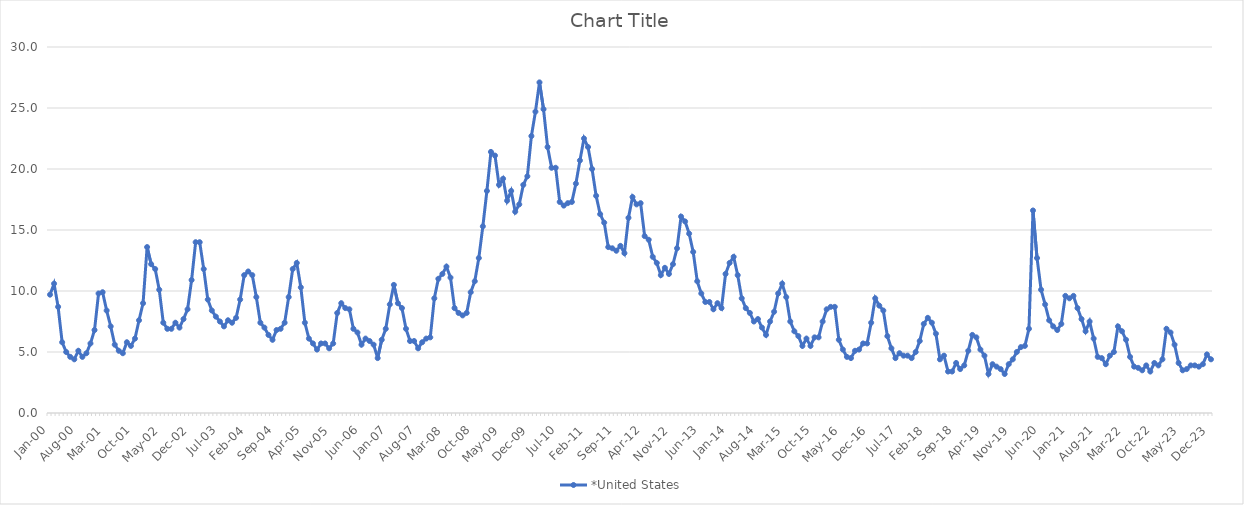
| Category | *United States | Alaska | Alabama | Arkansas | Arizona | California | Colorado | Connecticut | Delaware | Florida | Georgia | Hawaii | Iowa | Idaho | Illinois | Indiana | Kansas | Kentucky | Louisiana | Massachusetts | Maryland | Maine | Michigan | Minnesota | Missouri | Mississippi | Montana | North Carolina | North Dakota | Nebraska | New Hampshire | New Jersey | New Mexico | Nevada | New York | Ohio | Oklahoma | Oregon | Pennsylvania | Rhode Island | South Carolina | South Dakota | Tennessee | Texas | Utah | Virginia | Vermont | Washington | Wisconsin | West Virginia | Wyoming |
|---|---|---|---|---|---|---|---|---|---|---|---|---|---|---|---|---|---|---|---|---|---|---|---|---|---|---|---|---|---|---|---|---|---|---|---|---|---|---|---|---|---|---|---|---|---|---|---|---|---|---|---|
| Jan-00 | 9.7 |  |  |  |  |  |  |  |  |  |  |  |  |  |  |  |  |  |  |  |  |  |  |  |  |  |  |  |  |  |  |  |  |  |  |  |  |  |  |  |  |  |  |  |  |  |  |  |  |  |  |
| Feb-00 | 10.6 |  |  |  |  |  |  |  |  |  |  |  |  |  |  |  |  |  |  |  |  |  |  |  |  |  |  |  |  |  |  |  |  |  |  |  |  |  |  |  |  |  |  |  |  |  |  |  |  |  |  |
| Mar-00 | 8.7 |  |  |  |  |  |  |  |  |  |  |  |  |  |  |  |  |  |  |  |  |  |  |  |  |  |  |  |  |  |  |  |  |  |  |  |  |  |  |  |  |  |  |  |  |  |  |  |  |  |  |
| Apr-00 | 5.8 |  |  |  |  |  |  |  |  |  |  |  |  |  |  |  |  |  |  |  |  |  |  |  |  |  |  |  |  |  |  |  |  |  |  |  |  |  |  |  |  |  |  |  |  |  |  |  |  |  |  |
| May-00 | 5 |  |  |  |  |  |  |  |  |  |  |  |  |  |  |  |  |  |  |  |  |  |  |  |  |  |  |  |  |  |  |  |  |  |  |  |  |  |  |  |  |  |  |  |  |  |  |  |  |  |  |
| Jun-00 | 4.6 |  |  |  |  |  |  |  |  |  |  |  |  |  |  |  |  |  |  |  |  |  |  |  |  |  |  |  |  |  |  |  |  |  |  |  |  |  |  |  |  |  |  |  |  |  |  |  |  |  |  |
| Jul-00 | 4.4 |  |  |  |  |  |  |  |  |  |  |  |  |  |  |  |  |  |  |  |  |  |  |  |  |  |  |  |  |  |  |  |  |  |  |  |  |  |  |  |  |  |  |  |  |  |  |  |  |  |  |
| Aug-00 | 5.1 |  |  |  |  |  |  |  |  |  |  |  |  |  |  |  |  |  |  |  |  |  |  |  |  |  |  |  |  |  |  |  |  |  |  |  |  |  |  |  |  |  |  |  |  |  |  |  |  |  |  |
| Sep-00 | 4.6 |  |  |  |  |  |  |  |  |  |  |  |  |  |  |  |  |  |  |  |  |  |  |  |  |  |  |  |  |  |  |  |  |  |  |  |  |  |  |  |  |  |  |  |  |  |  |  |  |  |  |
| Oct-00 | 4.9 |  |  |  |  |  |  |  |  |  |  |  |  |  |  |  |  |  |  |  |  |  |  |  |  |  |  |  |  |  |  |  |  |  |  |  |  |  |  |  |  |  |  |  |  |  |  |  |  |  |  |
| Nov-00 | 5.7 |  |  |  |  |  |  |  |  |  |  |  |  |  |  |  |  |  |  |  |  |  |  |  |  |  |  |  |  |  |  |  |  |  |  |  |  |  |  |  |  |  |  |  |  |  |  |  |  |  |  |
| Dec-00 | 6.8 |  |  |  |  |  |  |  |  |  |  |  |  |  |  |  |  |  |  |  |  |  |  |  |  |  |  |  |  |  |  |  |  |  |  |  |  |  |  |  |  |  |  |  |  |  |  |  |  |  |  |
| Jan-01 | 9.8 |  |  |  |  |  |  |  |  |  |  |  |  |  |  |  |  |  |  |  |  |  |  |  |  |  |  |  |  |  |  |  |  |  |  |  |  |  |  |  |  |  |  |  |  |  |  |  |  |  |  |
| Feb-01 | 9.9 |  |  |  |  |  |  |  |  |  |  |  |  |  |  |  |  |  |  |  |  |  |  |  |  |  |  |  |  |  |  |  |  |  |  |  |  |  |  |  |  |  |  |  |  |  |  |  |  |  |  |
| Mar-01 | 8.4 |  |  |  |  |  |  |  |  |  |  |  |  |  |  |  |  |  |  |  |  |  |  |  |  |  |  |  |  |  |  |  |  |  |  |  |  |  |  |  |  |  |  |  |  |  |  |  |  |  |  |
| Apr-01 | 7.1 |  |  |  |  |  |  |  |  |  |  |  |  |  |  |  |  |  |  |  |  |  |  |  |  |  |  |  |  |  |  |  |  |  |  |  |  |  |  |  |  |  |  |  |  |  |  |  |  |  |  |
| May-01 | 5.6 |  |  |  |  |  |  |  |  |  |  |  |  |  |  |  |  |  |  |  |  |  |  |  |  |  |  |  |  |  |  |  |  |  |  |  |  |  |  |  |  |  |  |  |  |  |  |  |  |  |  |
| Jun-01 | 5.1 |  |  |  |  |  |  |  |  |  |  |  |  |  |  |  |  |  |  |  |  |  |  |  |  |  |  |  |  |  |  |  |  |  |  |  |  |  |  |  |  |  |  |  |  |  |  |  |  |  |  |
| Jul-01 | 4.9 |  |  |  |  |  |  |  |  |  |  |  |  |  |  |  |  |  |  |  |  |  |  |  |  |  |  |  |  |  |  |  |  |  |  |  |  |  |  |  |  |  |  |  |  |  |  |  |  |  |  |
| Aug-01 | 5.8 |  |  |  |  |  |  |  |  |  |  |  |  |  |  |  |  |  |  |  |  |  |  |  |  |  |  |  |  |  |  |  |  |  |  |  |  |  |  |  |  |  |  |  |  |  |  |  |  |  |  |
| Sep-01 | 5.5 |  |  |  |  |  |  |  |  |  |  |  |  |  |  |  |  |  |  |  |  |  |  |  |  |  |  |  |  |  |  |  |  |  |  |  |  |  |  |  |  |  |  |  |  |  |  |  |  |  |  |
| Oct-01 | 6.1 |  |  |  |  |  |  |  |  |  |  |  |  |  |  |  |  |  |  |  |  |  |  |  |  |  |  |  |  |  |  |  |  |  |  |  |  |  |  |  |  |  |  |  |  |  |  |  |  |  |  |
| Nov-01 | 7.6 |  |  |  |  |  |  |  |  |  |  |  |  |  |  |  |  |  |  |  |  |  |  |  |  |  |  |  |  |  |  |  |  |  |  |  |  |  |  |  |  |  |  |  |  |  |  |  |  |  |  |
| Dec-01 | 9 |  |  |  |  |  |  |  |  |  |  |  |  |  |  |  |  |  |  |  |  |  |  |  |  |  |  |  |  |  |  |  |  |  |  |  |  |  |  |  |  |  |  |  |  |  |  |  |  |  |  |
| Jan-02 | 13.6 |  |  |  |  |  |  |  |  |  |  |  |  |  |  |  |  |  |  |  |  |  |  |  |  |  |  |  |  |  |  |  |  |  |  |  |  |  |  |  |  |  |  |  |  |  |  |  |  |  |  |
| Feb-02 | 12.2 |  |  |  |  |  |  |  |  |  |  |  |  |  |  |  |  |  |  |  |  |  |  |  |  |  |  |  |  |  |  |  |  |  |  |  |  |  |  |  |  |  |  |  |  |  |  |  |  |  |  |
| Mar-02 | 11.8 |  |  |  |  |  |  |  |  |  |  |  |  |  |  |  |  |  |  |  |  |  |  |  |  |  |  |  |  |  |  |  |  |  |  |  |  |  |  |  |  |  |  |  |  |  |  |  |  |  |  |
| Apr-02 | 10.1 |  |  |  |  |  |  |  |  |  |  |  |  |  |  |  |  |  |  |  |  |  |  |  |  |  |  |  |  |  |  |  |  |  |  |  |  |  |  |  |  |  |  |  |  |  |  |  |  |  |  |
| May-02 | 7.4 |  |  |  |  |  |  |  |  |  |  |  |  |  |  |  |  |  |  |  |  |  |  |  |  |  |  |  |  |  |  |  |  |  |  |  |  |  |  |  |  |  |  |  |  |  |  |  |  |  |  |
| Jun-02 | 6.9 |  |  |  |  |  |  |  |  |  |  |  |  |  |  |  |  |  |  |  |  |  |  |  |  |  |  |  |  |  |  |  |  |  |  |  |  |  |  |  |  |  |  |  |  |  |  |  |  |  |  |
| Jul-02 | 6.9 |  |  |  |  |  |  |  |  |  |  |  |  |  |  |  |  |  |  |  |  |  |  |  |  |  |  |  |  |  |  |  |  |  |  |  |  |  |  |  |  |  |  |  |  |  |  |  |  |  |  |
| Aug-02 | 7.4 |  |  |  |  |  |  |  |  |  |  |  |  |  |  |  |  |  |  |  |  |  |  |  |  |  |  |  |  |  |  |  |  |  |  |  |  |  |  |  |  |  |  |  |  |  |  |  |  |  |  |
| Sep-02 | 7 |  |  |  |  |  |  |  |  |  |  |  |  |  |  |  |  |  |  |  |  |  |  |  |  |  |  |  |  |  |  |  |  |  |  |  |  |  |  |  |  |  |  |  |  |  |  |  |  |  |  |
| Oct-02 | 7.7 |  |  |  |  |  |  |  |  |  |  |  |  |  |  |  |  |  |  |  |  |  |  |  |  |  |  |  |  |  |  |  |  |  |  |  |  |  |  |  |  |  |  |  |  |  |  |  |  |  |  |
| Nov-02 | 8.5 |  |  |  |  |  |  |  |  |  |  |  |  |  |  |  |  |  |  |  |  |  |  |  |  |  |  |  |  |  |  |  |  |  |  |  |  |  |  |  |  |  |  |  |  |  |  |  |  |  |  |
| Dec-02 | 10.9 |  |  |  |  |  |  |  |  |  |  |  |  |  |  |  |  |  |  |  |  |  |  |  |  |  |  |  |  |  |  |  |  |  |  |  |  |  |  |  |  |  |  |  |  |  |  |  |  |  |  |
| Jan-03 | 14 |  |  |  |  |  |  |  |  |  |  |  |  |  |  |  |  |  |  |  |  |  |  |  |  |  |  |  |  |  |  |  |  |  |  |  |  |  |  |  |  |  |  |  |  |  |  |  |  |  |  |
| Feb-03 | 14 |  |  |  |  |  |  |  |  |  |  |  |  |  |  |  |  |  |  |  |  |  |  |  |  |  |  |  |  |  |  |  |  |  |  |  |  |  |  |  |  |  |  |  |  |  |  |  |  |  |  |
| Mar-03 | 11.8 |  |  |  |  |  |  |  |  |  |  |  |  |  |  |  |  |  |  |  |  |  |  |  |  |  |  |  |  |  |  |  |  |  |  |  |  |  |  |  |  |  |  |  |  |  |  |  |  |  |  |
| Apr-03 | 9.3 |  |  |  |  |  |  |  |  |  |  |  |  |  |  |  |  |  |  |  |  |  |  |  |  |  |  |  |  |  |  |  |  |  |  |  |  |  |  |  |  |  |  |  |  |  |  |  |  |  |  |
| May-03 | 8.4 |  |  |  |  |  |  |  |  |  |  |  |  |  |  |  |  |  |  |  |  |  |  |  |  |  |  |  |  |  |  |  |  |  |  |  |  |  |  |  |  |  |  |  |  |  |  |  |  |  |  |
| Jun-03 | 7.9 |  |  |  |  |  |  |  |  |  |  |  |  |  |  |  |  |  |  |  |  |  |  |  |  |  |  |  |  |  |  |  |  |  |  |  |  |  |  |  |  |  |  |  |  |  |  |  |  |  |  |
| Jul-03 | 7.5 |  |  |  |  |  |  |  |  |  |  |  |  |  |  |  |  |  |  |  |  |  |  |  |  |  |  |  |  |  |  |  |  |  |  |  |  |  |  |  |  |  |  |  |  |  |  |  |  |  |  |
| Aug-03 | 7.1 |  |  |  |  |  |  |  |  |  |  |  |  |  |  |  |  |  |  |  |  |  |  |  |  |  |  |  |  |  |  |  |  |  |  |  |  |  |  |  |  |  |  |  |  |  |  |  |  |  |  |
| Sep-03 | 7.6 |  |  |  |  |  |  |  |  |  |  |  |  |  |  |  |  |  |  |  |  |  |  |  |  |  |  |  |  |  |  |  |  |  |  |  |  |  |  |  |  |  |  |  |  |  |  |  |  |  |  |
| Oct-03 | 7.4 |  |  |  |  |  |  |  |  |  |  |  |  |  |  |  |  |  |  |  |  |  |  |  |  |  |  |  |  |  |  |  |  |  |  |  |  |  |  |  |  |  |  |  |  |  |  |  |  |  |  |
| Nov-03 | 7.8 |  |  |  |  |  |  |  |  |  |  |  |  |  |  |  |  |  |  |  |  |  |  |  |  |  |  |  |  |  |  |  |  |  |  |  |  |  |  |  |  |  |  |  |  |  |  |  |  |  |  |
| Dec-03 | 9.3 |  |  |  |  |  |  |  |  |  |  |  |  |  |  |  |  |  |  |  |  |  |  |  |  |  |  |  |  |  |  |  |  |  |  |  |  |  |  |  |  |  |  |  |  |  |  |  |  |  |  |
| Jan-04 | 11.3 |  |  |  |  |  |  |  |  |  |  |  |  |  |  |  |  |  |  |  |  |  |  |  |  |  |  |  |  |  |  |  |  |  |  |  |  |  |  |  |  |  |  |  |  |  |  |  |  |  |  |
| Feb-04 | 11.6 |  |  |  |  |  |  |  |  |  |  |  |  |  |  |  |  |  |  |  |  |  |  |  |  |  |  |  |  |  |  |  |  |  |  |  |  |  |  |  |  |  |  |  |  |  |  |  |  |  |  |
| Mar-04 | 11.3 |  |  |  |  |  |  |  |  |  |  |  |  |  |  |  |  |  |  |  |  |  |  |  |  |  |  |  |  |  |  |  |  |  |  |  |  |  |  |  |  |  |  |  |  |  |  |  |  |  |  |
| Apr-04 | 9.5 |  |  |  |  |  |  |  |  |  |  |  |  |  |  |  |  |  |  |  |  |  |  |  |  |  |  |  |  |  |  |  |  |  |  |  |  |  |  |  |  |  |  |  |  |  |  |  |  |  |  |
| May-04 | 7.4 |  |  |  |  |  |  |  |  |  |  |  |  |  |  |  |  |  |  |  |  |  |  |  |  |  |  |  |  |  |  |  |  |  |  |  |  |  |  |  |  |  |  |  |  |  |  |  |  |  |  |
| Jun-04 | 7 |  |  |  |  |  |  |  |  |  |  |  |  |  |  |  |  |  |  |  |  |  |  |  |  |  |  |  |  |  |  |  |  |  |  |  |  |  |  |  |  |  |  |  |  |  |  |  |  |  |  |
| Jul-04 | 6.4 |  |  |  |  |  |  |  |  |  |  |  |  |  |  |  |  |  |  |  |  |  |  |  |  |  |  |  |  |  |  |  |  |  |  |  |  |  |  |  |  |  |  |  |  |  |  |  |  |  |  |
| Aug-04 | 6 |  |  |  |  |  |  |  |  |  |  |  |  |  |  |  |  |  |  |  |  |  |  |  |  |  |  |  |  |  |  |  |  |  |  |  |  |  |  |  |  |  |  |  |  |  |  |  |  |  |  |
| Sep-04 | 6.8 |  |  |  |  |  |  |  |  |  |  |  |  |  |  |  |  |  |  |  |  |  |  |  |  |  |  |  |  |  |  |  |  |  |  |  |  |  |  |  |  |  |  |  |  |  |  |  |  |  |  |
| Oct-04 | 6.9 |  |  |  |  |  |  |  |  |  |  |  |  |  |  |  |  |  |  |  |  |  |  |  |  |  |  |  |  |  |  |  |  |  |  |  |  |  |  |  |  |  |  |  |  |  |  |  |  |  |  |
| Nov-04 | 7.4 |  |  |  |  |  |  |  |  |  |  |  |  |  |  |  |  |  |  |  |  |  |  |  |  |  |  |  |  |  |  |  |  |  |  |  |  |  |  |  |  |  |  |  |  |  |  |  |  |  |  |
| Dec-04 | 9.5 |  |  |  |  |  |  |  |  |  |  |  |  |  |  |  |  |  |  |  |  |  |  |  |  |  |  |  |  |  |  |  |  |  |  |  |  |  |  |  |  |  |  |  |  |  |  |  |  |  |  |
| Jan-05 | 11.8 |  |  |  |  |  |  |  |  |  |  |  |  |  |  |  |  |  |  |  |  |  |  |  |  |  |  |  |  |  |  |  |  |  |  |  |  |  |  |  |  |  |  |  |  |  |  |  |  |  |  |
| Feb-05 | 12.3 |  |  |  |  |  |  |  |  |  |  |  |  |  |  |  |  |  |  |  |  |  |  |  |  |  |  |  |  |  |  |  |  |  |  |  |  |  |  |  |  |  |  |  |  |  |  |  |  |  |  |
| Mar-05 | 10.3 |  |  |  |  |  |  |  |  |  |  |  |  |  |  |  |  |  |  |  |  |  |  |  |  |  |  |  |  |  |  |  |  |  |  |  |  |  |  |  |  |  |  |  |  |  |  |  |  |  |  |
| Apr-05 | 7.4 |  |  |  |  |  |  |  |  |  |  |  |  |  |  |  |  |  |  |  |  |  |  |  |  |  |  |  |  |  |  |  |  |  |  |  |  |  |  |  |  |  |  |  |  |  |  |  |  |  |  |
| May-05 | 6.1 |  |  |  |  |  |  |  |  |  |  |  |  |  |  |  |  |  |  |  |  |  |  |  |  |  |  |  |  |  |  |  |  |  |  |  |  |  |  |  |  |  |  |  |  |  |  |  |  |  |  |
| Jun-05 | 5.7 |  |  |  |  |  |  |  |  |  |  |  |  |  |  |  |  |  |  |  |  |  |  |  |  |  |  |  |  |  |  |  |  |  |  |  |  |  |  |  |  |  |  |  |  |  |  |  |  |  |  |
| Jul-05 | 5.2 |  |  |  |  |  |  |  |  |  |  |  |  |  |  |  |  |  |  |  |  |  |  |  |  |  |  |  |  |  |  |  |  |  |  |  |  |  |  |  |  |  |  |  |  |  |  |  |  |  |  |
| Aug-05 | 5.7 |  |  |  |  |  |  |  |  |  |  |  |  |  |  |  |  |  |  |  |  |  |  |  |  |  |  |  |  |  |  |  |  |  |  |  |  |  |  |  |  |  |  |  |  |  |  |  |  |  |  |
| Sep-05 | 5.7 |  |  |  |  |  |  |  |  |  |  |  |  |  |  |  |  |  |  |  |  |  |  |  |  |  |  |  |  |  |  |  |  |  |  |  |  |  |  |  |  |  |  |  |  |  |  |  |  |  |  |
| Oct-05 | 5.3 |  |  |  |  |  |  |  |  |  |  |  |  |  |  |  |  |  |  |  |  |  |  |  |  |  |  |  |  |  |  |  |  |  |  |  |  |  |  |  |  |  |  |  |  |  |  |  |  |  |  |
| Nov-05 | 5.7 |  |  |  |  |  |  |  |  |  |  |  |  |  |  |  |  |  |  |  |  |  |  |  |  |  |  |  |  |  |  |  |  |  |  |  |  |  |  |  |  |  |  |  |  |  |  |  |  |  |  |
| Dec-05 | 8.2 |  |  |  |  |  |  |  |  |  |  |  |  |  |  |  |  |  |  |  |  |  |  |  |  |  |  |  |  |  |  |  |  |  |  |  |  |  |  |  |  |  |  |  |  |  |  |  |  |  |  |
| Jan-06 | 9 |  |  |  |  |  |  |  |  |  |  |  |  |  |  |  |  |  |  |  |  |  |  |  |  |  |  |  |  |  |  |  |  |  |  |  |  |  |  |  |  |  |  |  |  |  |  |  |  |  |  |
| Feb-06 | 8.6 |  |  |  |  |  |  |  |  |  |  |  |  |  |  |  |  |  |  |  |  |  |  |  |  |  |  |  |  |  |  |  |  |  |  |  |  |  |  |  |  |  |  |  |  |  |  |  |  |  |  |
| Mar-06 | 8.5 |  |  |  |  |  |  |  |  |  |  |  |  |  |  |  |  |  |  |  |  |  |  |  |  |  |  |  |  |  |  |  |  |  |  |  |  |  |  |  |  |  |  |  |  |  |  |  |  |  |  |
| Apr-06 | 6.9 |  |  |  |  |  |  |  |  |  |  |  |  |  |  |  |  |  |  |  |  |  |  |  |  |  |  |  |  |  |  |  |  |  |  |  |  |  |  |  |  |  |  |  |  |  |  |  |  |  |  |
| May-06 | 6.6 |  |  |  |  |  |  |  |  |  |  |  |  |  |  |  |  |  |  |  |  |  |  |  |  |  |  |  |  |  |  |  |  |  |  |  |  |  |  |  |  |  |  |  |  |  |  |  |  |  |  |
| Jun-06 | 5.6 |  |  |  |  |  |  |  |  |  |  |  |  |  |  |  |  |  |  |  |  |  |  |  |  |  |  |  |  |  |  |  |  |  |  |  |  |  |  |  |  |  |  |  |  |  |  |  |  |  |  |
| Jul-06 | 6.1 |  |  |  |  |  |  |  |  |  |  |  |  |  |  |  |  |  |  |  |  |  |  |  |  |  |  |  |  |  |  |  |  |  |  |  |  |  |  |  |  |  |  |  |  |  |  |  |  |  |  |
| Aug-06 | 5.9 |  |  |  |  |  |  |  |  |  |  |  |  |  |  |  |  |  |  |  |  |  |  |  |  |  |  |  |  |  |  |  |  |  |  |  |  |  |  |  |  |  |  |  |  |  |  |  |  |  |  |
| Sep-06 | 5.6 |  |  |  |  |  |  |  |  |  |  |  |  |  |  |  |  |  |  |  |  |  |  |  |  |  |  |  |  |  |  |  |  |  |  |  |  |  |  |  |  |  |  |  |  |  |  |  |  |  |  |
| Oct-06 | 4.5 |  |  |  |  |  |  |  |  |  |  |  |  |  |  |  |  |  |  |  |  |  |  |  |  |  |  |  |  |  |  |  |  |  |  |  |  |  |  |  |  |  |  |  |  |  |  |  |  |  |  |
| Nov-06 | 6 |  |  |  |  |  |  |  |  |  |  |  |  |  |  |  |  |  |  |  |  |  |  |  |  |  |  |  |  |  |  |  |  |  |  |  |  |  |  |  |  |  |  |  |  |  |  |  |  |  |  |
| Dec-06 | 6.9 |  |  |  |  |  |  |  |  |  |  |  |  |  |  |  |  |  |  |  |  |  |  |  |  |  |  |  |  |  |  |  |  |  |  |  |  |  |  |  |  |  |  |  |  |  |  |  |  |  |  |
| Jan-07 | 8.9 |  |  |  |  |  |  |  |  |  |  |  |  |  |  |  |  |  |  |  |  |  |  |  |  |  |  |  |  |  |  |  |  |  |  |  |  |  |  |  |  |  |  |  |  |  |  |  |  |  |  |
| Feb-07 | 10.5 |  |  |  |  |  |  |  |  |  |  |  |  |  |  |  |  |  |  |  |  |  |  |  |  |  |  |  |  |  |  |  |  |  |  |  |  |  |  |  |  |  |  |  |  |  |  |  |  |  |  |
| Mar-07 | 9 |  |  |  |  |  |  |  |  |  |  |  |  |  |  |  |  |  |  |  |  |  |  |  |  |  |  |  |  |  |  |  |  |  |  |  |  |  |  |  |  |  |  |  |  |  |  |  |  |  |  |
| Apr-07 | 8.6 |  |  |  |  |  |  |  |  |  |  |  |  |  |  |  |  |  |  |  |  |  |  |  |  |  |  |  |  |  |  |  |  |  |  |  |  |  |  |  |  |  |  |  |  |  |  |  |  |  |  |
| May-07 | 6.9 |  |  |  |  |  |  |  |  |  |  |  |  |  |  |  |  |  |  |  |  |  |  |  |  |  |  |  |  |  |  |  |  |  |  |  |  |  |  |  |  |  |  |  |  |  |  |  |  |  |  |
| Jun-07 | 5.9 |  |  |  |  |  |  |  |  |  |  |  |  |  |  |  |  |  |  |  |  |  |  |  |  |  |  |  |  |  |  |  |  |  |  |  |  |  |  |  |  |  |  |  |  |  |  |  |  |  |  |
| Jul-07 | 5.9 |  |  |  |  |  |  |  |  |  |  |  |  |  |  |  |  |  |  |  |  |  |  |  |  |  |  |  |  |  |  |  |  |  |  |  |  |  |  |  |  |  |  |  |  |  |  |  |  |  |  |
| Aug-07 | 5.3 |  |  |  |  |  |  |  |  |  |  |  |  |  |  |  |  |  |  |  |  |  |  |  |  |  |  |  |  |  |  |  |  |  |  |  |  |  |  |  |  |  |  |  |  |  |  |  |  |  |  |
| Sep-07 | 5.8 |  |  |  |  |  |  |  |  |  |  |  |  |  |  |  |  |  |  |  |  |  |  |  |  |  |  |  |  |  |  |  |  |  |  |  |  |  |  |  |  |  |  |  |  |  |  |  |  |  |  |
| Oct-07 | 6.1 |  |  |  |  |  |  |  |  |  |  |  |  |  |  |  |  |  |  |  |  |  |  |  |  |  |  |  |  |  |  |  |  |  |  |  |  |  |  |  |  |  |  |  |  |  |  |  |  |  |  |
| Nov-07 | 6.2 |  |  |  |  |  |  |  |  |  |  |  |  |  |  |  |  |  |  |  |  |  |  |  |  |  |  |  |  |  |  |  |  |  |  |  |  |  |  |  |  |  |  |  |  |  |  |  |  |  |  |
| Dec-07 | 9.4 |  |  |  |  |  |  |  |  |  |  |  |  |  |  |  |  |  |  |  |  |  |  |  |  |  |  |  |  |  |  |  |  |  |  |  |  |  |  |  |  |  |  |  |  |  |  |  |  |  |  |
| Jan-08 | 11 |  |  |  |  |  |  |  |  |  |  |  |  |  |  |  |  |  |  |  |  |  |  |  |  |  |  |  |  |  |  |  |  |  |  |  |  |  |  |  |  |  |  |  |  |  |  |  |  |  |  |
| Feb-08 | 11.4 |  |  |  |  |  |  |  |  |  |  |  |  |  |  |  |  |  |  |  |  |  |  |  |  |  |  |  |  |  |  |  |  |  |  |  |  |  |  |  |  |  |  |  |  |  |  |  |  |  |  |
| Mar-08 | 12 |  |  |  |  |  |  |  |  |  |  |  |  |  |  |  |  |  |  |  |  |  |  |  |  |  |  |  |  |  |  |  |  |  |  |  |  |  |  |  |  |  |  |  |  |  |  |  |  |  |  |
| Apr-08 | 11.1 |  |  |  |  |  |  |  |  |  |  |  |  |  |  |  |  |  |  |  |  |  |  |  |  |  |  |  |  |  |  |  |  |  |  |  |  |  |  |  |  |  |  |  |  |  |  |  |  |  |  |
| May-08 | 8.6 |  |  |  |  |  |  |  |  |  |  |  |  |  |  |  |  |  |  |  |  |  |  |  |  |  |  |  |  |  |  |  |  |  |  |  |  |  |  |  |  |  |  |  |  |  |  |  |  |  |  |
| Jun-08 | 8.2 |  |  |  |  |  |  |  |  |  |  |  |  |  |  |  |  |  |  |  |  |  |  |  |  |  |  |  |  |  |  |  |  |  |  |  |  |  |  |  |  |  |  |  |  |  |  |  |  |  |  |
| Jul-08 | 8 |  |  |  |  |  |  |  |  |  |  |  |  |  |  |  |  |  |  |  |  |  |  |  |  |  |  |  |  |  |  |  |  |  |  |  |  |  |  |  |  |  |  |  |  |  |  |  |  |  |  |
| Aug-08 | 8.2 |  |  |  |  |  |  |  |  |  |  |  |  |  |  |  |  |  |  |  |  |  |  |  |  |  |  |  |  |  |  |  |  |  |  |  |  |  |  |  |  |  |  |  |  |  |  |  |  |  |  |
| Sep-08 | 9.9 |  |  |  |  |  |  |  |  |  |  |  |  |  |  |  |  |  |  |  |  |  |  |  |  |  |  |  |  |  |  |  |  |  |  |  |  |  |  |  |  |  |  |  |  |  |  |  |  |  |  |
| Oct-08 | 10.8 |  |  |  |  |  |  |  |  |  |  |  |  |  |  |  |  |  |  |  |  |  |  |  |  |  |  |  |  |  |  |  |  |  |  |  |  |  |  |  |  |  |  |  |  |  |  |  |  |  |  |
| Nov-08 | 12.7 |  |  |  |  |  |  |  |  |  |  |  |  |  |  |  |  |  |  |  |  |  |  |  |  |  |  |  |  |  |  |  |  |  |  |  |  |  |  |  |  |  |  |  |  |  |  |  |  |  |  |
| Dec-08 | 15.3 |  |  |  |  |  |  |  |  |  |  |  |  |  |  |  |  |  |  |  |  |  |  |  |  |  |  |  |  |  |  |  |  |  |  |  |  |  |  |  |  |  |  |  |  |  |  |  |  |  |  |
| Jan-09 | 18.2 |  |  |  |  |  |  |  |  |  |  |  |  |  |  |  |  |  |  |  |  |  |  |  |  |  |  |  |  |  |  |  |  |  |  |  |  |  |  |  |  |  |  |  |  |  |  |  |  |  |  |
| Feb-09 | 21.4 |  |  |  |  |  |  |  |  |  |  |  |  |  |  |  |  |  |  |  |  |  |  |  |  |  |  |  |  |  |  |  |  |  |  |  |  |  |  |  |  |  |  |  |  |  |  |  |  |  |  |
| Mar-09 | 21.1 |  |  |  |  |  |  |  |  |  |  |  |  |  |  |  |  |  |  |  |  |  |  |  |  |  |  |  |  |  |  |  |  |  |  |  |  |  |  |  |  |  |  |  |  |  |  |  |  |  |  |
| Apr-09 | 18.7 |  |  |  |  |  |  |  |  |  |  |  |  |  |  |  |  |  |  |  |  |  |  |  |  |  |  |  |  |  |  |  |  |  |  |  |  |  |  |  |  |  |  |  |  |  |  |  |  |  |  |
| May-09 | 19.2 |  |  |  |  |  |  |  |  |  |  |  |  |  |  |  |  |  |  |  |  |  |  |  |  |  |  |  |  |  |  |  |  |  |  |  |  |  |  |  |  |  |  |  |  |  |  |  |  |  |  |
| Jun-09 | 17.4 |  |  |  |  |  |  |  |  |  |  |  |  |  |  |  |  |  |  |  |  |  |  |  |  |  |  |  |  |  |  |  |  |  |  |  |  |  |  |  |  |  |  |  |  |  |  |  |  |  |  |
| Jul-09 | 18.2 |  |  |  |  |  |  |  |  |  |  |  |  |  |  |  |  |  |  |  |  |  |  |  |  |  |  |  |  |  |  |  |  |  |  |  |  |  |  |  |  |  |  |  |  |  |  |  |  |  |  |
| Aug-09 | 16.5 |  |  |  |  |  |  |  |  |  |  |  |  |  |  |  |  |  |  |  |  |  |  |  |  |  |  |  |  |  |  |  |  |  |  |  |  |  |  |  |  |  |  |  |  |  |  |  |  |  |  |
| Sep-09 | 17.1 |  |  |  |  |  |  |  |  |  |  |  |  |  |  |  |  |  |  |  |  |  |  |  |  |  |  |  |  |  |  |  |  |  |  |  |  |  |  |  |  |  |  |  |  |  |  |  |  |  |  |
| Oct-09 | 18.7 |  |  |  |  |  |  |  |  |  |  |  |  |  |  |  |  |  |  |  |  |  |  |  |  |  |  |  |  |  |  |  |  |  |  |  |  |  |  |  |  |  |  |  |  |  |  |  |  |  |  |
| Nov-09 | 19.4 |  |  |  |  |  |  |  |  |  |  |  |  |  |  |  |  |  |  |  |  |  |  |  |  |  |  |  |  |  |  |  |  |  |  |  |  |  |  |  |  |  |  |  |  |  |  |  |  |  |  |
| Dec-09 | 22.7 |  |  |  |  |  |  |  |  |  |  |  |  |  |  |  |  |  |  |  |  |  |  |  |  |  |  |  |  |  |  |  |  |  |  |  |  |  |  |  |  |  |  |  |  |  |  |  |  |  |  |
| Jan-10 | 24.7 |  |  |  |  |  |  |  |  |  |  |  |  |  |  |  |  |  |  |  |  |  |  |  |  |  |  |  |  |  |  |  |  |  |  |  |  |  |  |  |  |  |  |  |  |  |  |  |  |  |  |
| Feb-10 | 27.1 |  |  |  |  |  |  |  |  |  |  |  |  |  |  |  |  |  |  |  |  |  |  |  |  |  |  |  |  |  |  |  |  |  |  |  |  |  |  |  |  |  |  |  |  |  |  |  |  |  |  |
| Mar-10 | 24.9 |  |  |  |  |  |  |  |  |  |  |  |  |  |  |  |  |  |  |  |  |  |  |  |  |  |  |  |  |  |  |  |  |  |  |  |  |  |  |  |  |  |  |  |  |  |  |  |  |  |  |
| Apr-10 | 21.8 |  |  |  |  |  |  |  |  |  |  |  |  |  |  |  |  |  |  |  |  |  |  |  |  |  |  |  |  |  |  |  |  |  |  |  |  |  |  |  |  |  |  |  |  |  |  |  |  |  |  |
| May-10 | 20.1 |  |  |  |  |  |  |  |  |  |  |  |  |  |  |  |  |  |  |  |  |  |  |  |  |  |  |  |  |  |  |  |  |  |  |  |  |  |  |  |  |  |  |  |  |  |  |  |  |  |  |
| Jun-10 | 20.1 |  |  |  |  |  |  |  |  |  |  |  |  |  |  |  |  |  |  |  |  |  |  |  |  |  |  |  |  |  |  |  |  |  |  |  |  |  |  |  |  |  |  |  |  |  |  |  |  |  |  |
| Jul-10 | 17.3 |  |  |  |  |  |  |  |  |  |  |  |  |  |  |  |  |  |  |  |  |  |  |  |  |  |  |  |  |  |  |  |  |  |  |  |  |  |  |  |  |  |  |  |  |  |  |  |  |  |  |
| Aug-10 | 17 |  |  |  |  |  |  |  |  |  |  |  |  |  |  |  |  |  |  |  |  |  |  |  |  |  |  |  |  |  |  |  |  |  |  |  |  |  |  |  |  |  |  |  |  |  |  |  |  |  |  |
| Sep-10 | 17.2 |  |  |  |  |  |  |  |  |  |  |  |  |  |  |  |  |  |  |  |  |  |  |  |  |  |  |  |  |  |  |  |  |  |  |  |  |  |  |  |  |  |  |  |  |  |  |  |  |  |  |
| Oct-10 | 17.3 |  |  |  |  |  |  |  |  |  |  |  |  |  |  |  |  |  |  |  |  |  |  |  |  |  |  |  |  |  |  |  |  |  |  |  |  |  |  |  |  |  |  |  |  |  |  |  |  |  |  |
| Nov-10 | 18.8 |  |  |  |  |  |  |  |  |  |  |  |  |  |  |  |  |  |  |  |  |  |  |  |  |  |  |  |  |  |  |  |  |  |  |  |  |  |  |  |  |  |  |  |  |  |  |  |  |  |  |
| Dec-10 | 20.7 |  |  |  |  |  |  |  |  |  |  |  |  |  |  |  |  |  |  |  |  |  |  |  |  |  |  |  |  |  |  |  |  |  |  |  |  |  |  |  |  |  |  |  |  |  |  |  |  |  |  |
| Jan-11 | 22.5 |  |  |  |  |  |  |  |  |  |  |  |  |  |  |  |  |  |  |  |  |  |  |  |  |  |  |  |  |  |  |  |  |  |  |  |  |  |  |  |  |  |  |  |  |  |  |  |  |  |  |
| Feb-11 | 21.8 |  |  |  |  |  |  |  |  |  |  |  |  |  |  |  |  |  |  |  |  |  |  |  |  |  |  |  |  |  |  |  |  |  |  |  |  |  |  |  |  |  |  |  |  |  |  |  |  |  |  |
| Mar-11 | 20 |  |  |  |  |  |  |  |  |  |  |  |  |  |  |  |  |  |  |  |  |  |  |  |  |  |  |  |  |  |  |  |  |  |  |  |  |  |  |  |  |  |  |  |  |  |  |  |  |  |  |
| Apr-11 | 17.8 |  |  |  |  |  |  |  |  |  |  |  |  |  |  |  |  |  |  |  |  |  |  |  |  |  |  |  |  |  |  |  |  |  |  |  |  |  |  |  |  |  |  |  |  |  |  |  |  |  |  |
| May-11 | 16.3 |  |  |  |  |  |  |  |  |  |  |  |  |  |  |  |  |  |  |  |  |  |  |  |  |  |  |  |  |  |  |  |  |  |  |  |  |  |  |  |  |  |  |  |  |  |  |  |  |  |  |
| Jun-11 | 15.6 |  |  |  |  |  |  |  |  |  |  |  |  |  |  |  |  |  |  |  |  |  |  |  |  |  |  |  |  |  |  |  |  |  |  |  |  |  |  |  |  |  |  |  |  |  |  |  |  |  |  |
| Jul-11 | 13.6 |  |  |  |  |  |  |  |  |  |  |  |  |  |  |  |  |  |  |  |  |  |  |  |  |  |  |  |  |  |  |  |  |  |  |  |  |  |  |  |  |  |  |  |  |  |  |  |  |  |  |
| Aug-11 | 13.5 |  |  |  |  |  |  |  |  |  |  |  |  |  |  |  |  |  |  |  |  |  |  |  |  |  |  |  |  |  |  |  |  |  |  |  |  |  |  |  |  |  |  |  |  |  |  |  |  |  |  |
| Sep-11 | 13.3 |  |  |  |  |  |  |  |  |  |  |  |  |  |  |  |  |  |  |  |  |  |  |  |  |  |  |  |  |  |  |  |  |  |  |  |  |  |  |  |  |  |  |  |  |  |  |  |  |  |  |
| Oct-11 | 13.7 |  |  |  |  |  |  |  |  |  |  |  |  |  |  |  |  |  |  |  |  |  |  |  |  |  |  |  |  |  |  |  |  |  |  |  |  |  |  |  |  |  |  |  |  |  |  |  |  |  |  |
| Nov-11 | 13.1 |  |  |  |  |  |  |  |  |  |  |  |  |  |  |  |  |  |  |  |  |  |  |  |  |  |  |  |  |  |  |  |  |  |  |  |  |  |  |  |  |  |  |  |  |  |  |  |  |  |  |
| Dec-11 | 16 |  |  |  |  |  |  |  |  |  |  |  |  |  |  |  |  |  |  |  |  |  |  |  |  |  |  |  |  |  |  |  |  |  |  |  |  |  |  |  |  |  |  |  |  |  |  |  |  |  |  |
| Jan-12 | 17.7 |  |  |  |  |  |  |  |  |  |  |  |  |  |  |  |  |  |  |  |  |  |  |  |  |  |  |  |  |  |  |  |  |  |  |  |  |  |  |  |  |  |  |  |  |  |  |  |  |  |  |
| Feb-12 | 17.1 |  |  |  |  |  |  |  |  |  |  |  |  |  |  |  |  |  |  |  |  |  |  |  |  |  |  |  |  |  |  |  |  |  |  |  |  |  |  |  |  |  |  |  |  |  |  |  |  |  |  |
| Mar-12 | 17.2 |  |  |  |  |  |  |  |  |  |  |  |  |  |  |  |  |  |  |  |  |  |  |  |  |  |  |  |  |  |  |  |  |  |  |  |  |  |  |  |  |  |  |  |  |  |  |  |  |  |  |
| Apr-12 | 14.5 |  |  |  |  |  |  |  |  |  |  |  |  |  |  |  |  |  |  |  |  |  |  |  |  |  |  |  |  |  |  |  |  |  |  |  |  |  |  |  |  |  |  |  |  |  |  |  |  |  |  |
| May-12 | 14.2 |  |  |  |  |  |  |  |  |  |  |  |  |  |  |  |  |  |  |  |  |  |  |  |  |  |  |  |  |  |  |  |  |  |  |  |  |  |  |  |  |  |  |  |  |  |  |  |  |  |  |
| Jun-12 | 12.8 |  |  |  |  |  |  |  |  |  |  |  |  |  |  |  |  |  |  |  |  |  |  |  |  |  |  |  |  |  |  |  |  |  |  |  |  |  |  |  |  |  |  |  |  |  |  |  |  |  |  |
| Jul-12 | 12.3 |  |  |  |  |  |  |  |  |  |  |  |  |  |  |  |  |  |  |  |  |  |  |  |  |  |  |  |  |  |  |  |  |  |  |  |  |  |  |  |  |  |  |  |  |  |  |  |  |  |  |
| Aug-12 | 11.3 |  |  |  |  |  |  |  |  |  |  |  |  |  |  |  |  |  |  |  |  |  |  |  |  |  |  |  |  |  |  |  |  |  |  |  |  |  |  |  |  |  |  |  |  |  |  |  |  |  |  |
| Sep-12 | 11.9 |  |  |  |  |  |  |  |  |  |  |  |  |  |  |  |  |  |  |  |  |  |  |  |  |  |  |  |  |  |  |  |  |  |  |  |  |  |  |  |  |  |  |  |  |  |  |  |  |  |  |
| Oct-12 | 11.4 |  |  |  |  |  |  |  |  |  |  |  |  |  |  |  |  |  |  |  |  |  |  |  |  |  |  |  |  |  |  |  |  |  |  |  |  |  |  |  |  |  |  |  |  |  |  |  |  |  |  |
| Nov-12 | 12.2 |  |  |  |  |  |  |  |  |  |  |  |  |  |  |  |  |  |  |  |  |  |  |  |  |  |  |  |  |  |  |  |  |  |  |  |  |  |  |  |  |  |  |  |  |  |  |  |  |  |  |
| Dec-12 | 13.5 |  |  |  |  |  |  |  |  |  |  |  |  |  |  |  |  |  |  |  |  |  |  |  |  |  |  |  |  |  |  |  |  |  |  |  |  |  |  |  |  |  |  |  |  |  |  |  |  |  |  |
| Jan-13 | 16.1 |  |  |  |  |  |  |  |  |  |  |  |  |  |  |  |  |  |  |  |  |  |  |  |  |  |  |  |  |  |  |  |  |  |  |  |  |  |  |  |  |  |  |  |  |  |  |  |  |  |  |
| Feb-13 | 15.7 |  |  |  |  |  |  |  |  |  |  |  |  |  |  |  |  |  |  |  |  |  |  |  |  |  |  |  |  |  |  |  |  |  |  |  |  |  |  |  |  |  |  |  |  |  |  |  |  |  |  |
| Mar-13 | 14.7 |  |  |  |  |  |  |  |  |  |  |  |  |  |  |  |  |  |  |  |  |  |  |  |  |  |  |  |  |  |  |  |  |  |  |  |  |  |  |  |  |  |  |  |  |  |  |  |  |  |  |
| Apr-13 | 13.2 |  |  |  |  |  |  |  |  |  |  |  |  |  |  |  |  |  |  |  |  |  |  |  |  |  |  |  |  |  |  |  |  |  |  |  |  |  |  |  |  |  |  |  |  |  |  |  |  |  |  |
| May-13 | 10.8 |  |  |  |  |  |  |  |  |  |  |  |  |  |  |  |  |  |  |  |  |  |  |  |  |  |  |  |  |  |  |  |  |  |  |  |  |  |  |  |  |  |  |  |  |  |  |  |  |  |  |
| Jun-13 | 9.8 |  |  |  |  |  |  |  |  |  |  |  |  |  |  |  |  |  |  |  |  |  |  |  |  |  |  |  |  |  |  |  |  |  |  |  |  |  |  |  |  |  |  |  |  |  |  |  |  |  |  |
| Jul-13 | 9.1 |  |  |  |  |  |  |  |  |  |  |  |  |  |  |  |  |  |  |  |  |  |  |  |  |  |  |  |  |  |  |  |  |  |  |  |  |  |  |  |  |  |  |  |  |  |  |  |  |  |  |
| Aug-13 | 9.1 |  |  |  |  |  |  |  |  |  |  |  |  |  |  |  |  |  |  |  |  |  |  |  |  |  |  |  |  |  |  |  |  |  |  |  |  |  |  |  |  |  |  |  |  |  |  |  |  |  |  |
| Sep-13 | 8.5 |  |  |  |  |  |  |  |  |  |  |  |  |  |  |  |  |  |  |  |  |  |  |  |  |  |  |  |  |  |  |  |  |  |  |  |  |  |  |  |  |  |  |  |  |  |  |  |  |  |  |
| Oct-13 | 9 |  |  |  |  |  |  |  |  |  |  |  |  |  |  |  |  |  |  |  |  |  |  |  |  |  |  |  |  |  |  |  |  |  |  |  |  |  |  |  |  |  |  |  |  |  |  |  |  |  |  |
| Nov-13 | 8.6 |  |  |  |  |  |  |  |  |  |  |  |  |  |  |  |  |  |  |  |  |  |  |  |  |  |  |  |  |  |  |  |  |  |  |  |  |  |  |  |  |  |  |  |  |  |  |  |  |  |  |
| Dec-13 | 11.4 |  |  |  |  |  |  |  |  |  |  |  |  |  |  |  |  |  |  |  |  |  |  |  |  |  |  |  |  |  |  |  |  |  |  |  |  |  |  |  |  |  |  |  |  |  |  |  |  |  |  |
| Jan-14 | 12.3 |  |  |  |  |  |  |  |  |  |  |  |  |  |  |  |  |  |  |  |  |  |  |  |  |  |  |  |  |  |  |  |  |  |  |  |  |  |  |  |  |  |  |  |  |  |  |  |  |  |  |
| Feb-14 | 12.8 |  |  |  |  |  |  |  |  |  |  |  |  |  |  |  |  |  |  |  |  |  |  |  |  |  |  |  |  |  |  |  |  |  |  |  |  |  |  |  |  |  |  |  |  |  |  |  |  |  |  |
| Mar-14 | 11.3 |  |  |  |  |  |  |  |  |  |  |  |  |  |  |  |  |  |  |  |  |  |  |  |  |  |  |  |  |  |  |  |  |  |  |  |  |  |  |  |  |  |  |  |  |  |  |  |  |  |  |
| Apr-14 | 9.4 |  |  |  |  |  |  |  |  |  |  |  |  |  |  |  |  |  |  |  |  |  |  |  |  |  |  |  |  |  |  |  |  |  |  |  |  |  |  |  |  |  |  |  |  |  |  |  |  |  |  |
| May-14 | 8.6 |  |  |  |  |  |  |  |  |  |  |  |  |  |  |  |  |  |  |  |  |  |  |  |  |  |  |  |  |  |  |  |  |  |  |  |  |  |  |  |  |  |  |  |  |  |  |  |  |  |  |
| Jun-14 | 8.2 |  |  |  |  |  |  |  |  |  |  |  |  |  |  |  |  |  |  |  |  |  |  |  |  |  |  |  |  |  |  |  |  |  |  |  |  |  |  |  |  |  |  |  |  |  |  |  |  |  |  |
| Jul-14 | 7.5 |  |  |  |  |  |  |  |  |  |  |  |  |  |  |  |  |  |  |  |  |  |  |  |  |  |  |  |  |  |  |  |  |  |  |  |  |  |  |  |  |  |  |  |  |  |  |  |  |  |  |
| Aug-14 | 7.7 |  |  |  |  |  |  |  |  |  |  |  |  |  |  |  |  |  |  |  |  |  |  |  |  |  |  |  |  |  |  |  |  |  |  |  |  |  |  |  |  |  |  |  |  |  |  |  |  |  |  |
| Sep-14 | 7 |  |  |  |  |  |  |  |  |  |  |  |  |  |  |  |  |  |  |  |  |  |  |  |  |  |  |  |  |  |  |  |  |  |  |  |  |  |  |  |  |  |  |  |  |  |  |  |  |  |  |
| Oct-14 | 6.4 |  |  |  |  |  |  |  |  |  |  |  |  |  |  |  |  |  |  |  |  |  |  |  |  |  |  |  |  |  |  |  |  |  |  |  |  |  |  |  |  |  |  |  |  |  |  |  |  |  |  |
| Nov-14 | 7.5 |  |  |  |  |  |  |  |  |  |  |  |  |  |  |  |  |  |  |  |  |  |  |  |  |  |  |  |  |  |  |  |  |  |  |  |  |  |  |  |  |  |  |  |  |  |  |  |  |  |  |
| Dec-14 | 8.3 |  |  |  |  |  |  |  |  |  |  |  |  |  |  |  |  |  |  |  |  |  |  |  |  |  |  |  |  |  |  |  |  |  |  |  |  |  |  |  |  |  |  |  |  |  |  |  |  |  |  |
| Jan-15 | 9.8 |  |  |  |  |  |  |  |  |  |  |  |  |  |  |  |  |  |  |  |  |  |  |  |  |  |  |  |  |  |  |  |  |  |  |  |  |  |  |  |  |  |  |  |  |  |  |  |  |  |  |
| Feb-15 | 10.6 |  |  |  |  |  |  |  |  |  |  |  |  |  |  |  |  |  |  |  |  |  |  |  |  |  |  |  |  |  |  |  |  |  |  |  |  |  |  |  |  |  |  |  |  |  |  |  |  |  |  |
| Mar-15 | 9.5 |  |  |  |  |  |  |  |  |  |  |  |  |  |  |  |  |  |  |  |  |  |  |  |  |  |  |  |  |  |  |  |  |  |  |  |  |  |  |  |  |  |  |  |  |  |  |  |  |  |  |
| Apr-15 | 7.5 |  |  |  |  |  |  |  |  |  |  |  |  |  |  |  |  |  |  |  |  |  |  |  |  |  |  |  |  |  |  |  |  |  |  |  |  |  |  |  |  |  |  |  |  |  |  |  |  |  |  |
| May-15 | 6.7 |  |  |  |  |  |  |  |  |  |  |  |  |  |  |  |  |  |  |  |  |  |  |  |  |  |  |  |  |  |  |  |  |  |  |  |  |  |  |  |  |  |  |  |  |  |  |  |  |  |  |
| Jun-15 | 6.3 |  |  |  |  |  |  |  |  |  |  |  |  |  |  |  |  |  |  |  |  |  |  |  |  |  |  |  |  |  |  |  |  |  |  |  |  |  |  |  |  |  |  |  |  |  |  |  |  |  |  |
| Jul-15 | 5.5 |  |  |  |  |  |  |  |  |  |  |  |  |  |  |  |  |  |  |  |  |  |  |  |  |  |  |  |  |  |  |  |  |  |  |  |  |  |  |  |  |  |  |  |  |  |  |  |  |  |  |
| Aug-15 | 6.1 |  |  |  |  |  |  |  |  |  |  |  |  |  |  |  |  |  |  |  |  |  |  |  |  |  |  |  |  |  |  |  |  |  |  |  |  |  |  |  |  |  |  |  |  |  |  |  |  |  |  |
| Sep-15 | 5.5 |  |  |  |  |  |  |  |  |  |  |  |  |  |  |  |  |  |  |  |  |  |  |  |  |  |  |  |  |  |  |  |  |  |  |  |  |  |  |  |  |  |  |  |  |  |  |  |  |  |  |
| Oct-15 | 6.2 |  |  |  |  |  |  |  |  |  |  |  |  |  |  |  |  |  |  |  |  |  |  |  |  |  |  |  |  |  |  |  |  |  |  |  |  |  |  |  |  |  |  |  |  |  |  |  |  |  |  |
| Nov-15 | 6.2 |  |  |  |  |  |  |  |  |  |  |  |  |  |  |  |  |  |  |  |  |  |  |  |  |  |  |  |  |  |  |  |  |  |  |  |  |  |  |  |  |  |  |  |  |  |  |  |  |  |  |
| Dec-15 | 7.5 |  |  |  |  |  |  |  |  |  |  |  |  |  |  |  |  |  |  |  |  |  |  |  |  |  |  |  |  |  |  |  |  |  |  |  |  |  |  |  |  |  |  |  |  |  |  |  |  |  |  |
| Jan-16 | 8.5 |  |  |  |  |  |  |  |  |  |  |  |  |  |  |  |  |  |  |  |  |  |  |  |  |  |  |  |  |  |  |  |  |  |  |  |  |  |  |  |  |  |  |  |  |  |  |  |  |  |  |
| Feb-16 | 8.7 |  |  |  |  |  |  |  |  |  |  |  |  |  |  |  |  |  |  |  |  |  |  |  |  |  |  |  |  |  |  |  |  |  |  |  |  |  |  |  |  |  |  |  |  |  |  |  |  |  |  |
| Mar-16 | 8.7 |  |  |  |  |  |  |  |  |  |  |  |  |  |  |  |  |  |  |  |  |  |  |  |  |  |  |  |  |  |  |  |  |  |  |  |  |  |  |  |  |  |  |  |  |  |  |  |  |  |  |
| Apr-16 | 6 |  |  |  |  |  |  |  |  |  |  |  |  |  |  |  |  |  |  |  |  |  |  |  |  |  |  |  |  |  |  |  |  |  |  |  |  |  |  |  |  |  |  |  |  |  |  |  |  |  |  |
| May-16 | 5.2 |  |  |  |  |  |  |  |  |  |  |  |  |  |  |  |  |  |  |  |  |  |  |  |  |  |  |  |  |  |  |  |  |  |  |  |  |  |  |  |  |  |  |  |  |  |  |  |  |  |  |
| Jun-16 | 4.6 |  |  |  |  |  |  |  |  |  |  |  |  |  |  |  |  |  |  |  |  |  |  |  |  |  |  |  |  |  |  |  |  |  |  |  |  |  |  |  |  |  |  |  |  |  |  |  |  |  |  |
| Jul-16 | 4.5 |  |  |  |  |  |  |  |  |  |  |  |  |  |  |  |  |  |  |  |  |  |  |  |  |  |  |  |  |  |  |  |  |  |  |  |  |  |  |  |  |  |  |  |  |  |  |  |  |  |  |
| Aug-16 | 5.1 |  |  |  |  |  |  |  |  |  |  |  |  |  |  |  |  |  |  |  |  |  |  |  |  |  |  |  |  |  |  |  |  |  |  |  |  |  |  |  |  |  |  |  |  |  |  |  |  |  |  |
| Sep-16 | 5.2 |  |  |  |  |  |  |  |  |  |  |  |  |  |  |  |  |  |  |  |  |  |  |  |  |  |  |  |  |  |  |  |  |  |  |  |  |  |  |  |  |  |  |  |  |  |  |  |  |  |  |
| Oct-16 | 5.7 |  |  |  |  |  |  |  |  |  |  |  |  |  |  |  |  |  |  |  |  |  |  |  |  |  |  |  |  |  |  |  |  |  |  |  |  |  |  |  |  |  |  |  |  |  |  |  |  |  |  |
| Nov-16 | 5.7 |  |  |  |  |  |  |  |  |  |  |  |  |  |  |  |  |  |  |  |  |  |  |  |  |  |  |  |  |  |  |  |  |  |  |  |  |  |  |  |  |  |  |  |  |  |  |  |  |  |  |
| Dec-16 | 7.4 |  |  |  |  |  |  |  |  |  |  |  |  |  |  |  |  |  |  |  |  |  |  |  |  |  |  |  |  |  |  |  |  |  |  |  |  |  |  |  |  |  |  |  |  |  |  |  |  |  |  |
| Jan-17 | 9.4 |  |  |  |  |  |  |  |  |  |  |  |  |  |  |  |  |  |  |  |  |  |  |  |  |  |  |  |  |  |  |  |  |  |  |  |  |  |  |  |  |  |  |  |  |  |  |  |  |  |  |
| Feb-17 | 8.8 |  |  |  |  |  |  |  |  |  |  |  |  |  |  |  |  |  |  |  |  |  |  |  |  |  |  |  |  |  |  |  |  |  |  |  |  |  |  |  |  |  |  |  |  |  |  |  |  |  |  |
| Mar-17 | 8.4 |  |  |  |  |  |  |  |  |  |  |  |  |  |  |  |  |  |  |  |  |  |  |  |  |  |  |  |  |  |  |  |  |  |  |  |  |  |  |  |  |  |  |  |  |  |  |  |  |  |  |
| Apr-17 | 6.3 |  |  |  |  |  |  |  |  |  |  |  |  |  |  |  |  |  |  |  |  |  |  |  |  |  |  |  |  |  |  |  |  |  |  |  |  |  |  |  |  |  |  |  |  |  |  |  |  |  |  |
| May-17 | 5.3 |  |  |  |  |  |  |  |  |  |  |  |  |  |  |  |  |  |  |  |  |  |  |  |  |  |  |  |  |  |  |  |  |  |  |  |  |  |  |  |  |  |  |  |  |  |  |  |  |  |  |
| Jun-17 | 4.5 |  |  |  |  |  |  |  |  |  |  |  |  |  |  |  |  |  |  |  |  |  |  |  |  |  |  |  |  |  |  |  |  |  |  |  |  |  |  |  |  |  |  |  |  |  |  |  |  |  |  |
| Jul-17 | 4.9 |  |  |  |  |  |  |  |  |  |  |  |  |  |  |  |  |  |  |  |  |  |  |  |  |  |  |  |  |  |  |  |  |  |  |  |  |  |  |  |  |  |  |  |  |  |  |  |  |  |  |
| Aug-17 | 4.7 |  |  |  |  |  |  |  |  |  |  |  |  |  |  |  |  |  |  |  |  |  |  |  |  |  |  |  |  |  |  |  |  |  |  |  |  |  |  |  |  |  |  |  |  |  |  |  |  |  |  |
| Sep-17 | 4.7 |  |  |  |  |  |  |  |  |  |  |  |  |  |  |  |  |  |  |  |  |  |  |  |  |  |  |  |  |  |  |  |  |  |  |  |  |  |  |  |  |  |  |  |  |  |  |  |  |  |  |
| Oct-17 | 4.5 |  |  |  |  |  |  |  |  |  |  |  |  |  |  |  |  |  |  |  |  |  |  |  |  |  |  |  |  |  |  |  |  |  |  |  |  |  |  |  |  |  |  |  |  |  |  |  |  |  |  |
| Nov-17 | 5 |  |  |  |  |  |  |  |  |  |  |  |  |  |  |  |  |  |  |  |  |  |  |  |  |  |  |  |  |  |  |  |  |  |  |  |  |  |  |  |  |  |  |  |  |  |  |  |  |  |  |
| Dec-17 | 5.9 |  |  |  |  |  |  |  |  |  |  |  |  |  |  |  |  |  |  |  |  |  |  |  |  |  |  |  |  |  |  |  |  |  |  |  |  |  |  |  |  |  |  |  |  |  |  |  |  |  |  |
| Jan-18 | 7.3 |  |  |  |  |  |  |  |  |  |  |  |  |  |  |  |  |  |  |  |  |  |  |  |  |  |  |  |  |  |  |  |  |  |  |  |  |  |  |  |  |  |  |  |  |  |  |  |  |  |  |
| Feb-18 | 7.8 |  |  |  |  |  |  |  |  |  |  |  |  |  |  |  |  |  |  |  |  |  |  |  |  |  |  |  |  |  |  |  |  |  |  |  |  |  |  |  |  |  |  |  |  |  |  |  |  |  |  |
| Mar-18 | 7.4 |  |  |  |  |  |  |  |  |  |  |  |  |  |  |  |  |  |  |  |  |  |  |  |  |  |  |  |  |  |  |  |  |  |  |  |  |  |  |  |  |  |  |  |  |  |  |  |  |  |  |
| Apr-18 | 6.5 |  |  |  |  |  |  |  |  |  |  |  |  |  |  |  |  |  |  |  |  |  |  |  |  |  |  |  |  |  |  |  |  |  |  |  |  |  |  |  |  |  |  |  |  |  |  |  |  |  |  |
| May-18 | 4.4 |  |  |  |  |  |  |  |  |  |  |  |  |  |  |  |  |  |  |  |  |  |  |  |  |  |  |  |  |  |  |  |  |  |  |  |  |  |  |  |  |  |  |  |  |  |  |  |  |  |  |
| Jun-18 | 4.7 |  |  |  |  |  |  |  |  |  |  |  |  |  |  |  |  |  |  |  |  |  |  |  |  |  |  |  |  |  |  |  |  |  |  |  |  |  |  |  |  |  |  |  |  |  |  |  |  |  |  |
| Jul-18 | 3.4 |  |  |  |  |  |  |  |  |  |  |  |  |  |  |  |  |  |  |  |  |  |  |  |  |  |  |  |  |  |  |  |  |  |  |  |  |  |  |  |  |  |  |  |  |  |  |  |  |  |  |
| Aug-18 | 3.4 |  |  |  |  |  |  |  |  |  |  |  |  |  |  |  |  |  |  |  |  |  |  |  |  |  |  |  |  |  |  |  |  |  |  |  |  |  |  |  |  |  |  |  |  |  |  |  |  |  |  |
| Sep-18 | 4.1 |  |  |  |  |  |  |  |  |  |  |  |  |  |  |  |  |  |  |  |  |  |  |  |  |  |  |  |  |  |  |  |  |  |  |  |  |  |  |  |  |  |  |  |  |  |  |  |  |  |  |
| Oct-18 | 3.6 |  |  |  |  |  |  |  |  |  |  |  |  |  |  |  |  |  |  |  |  |  |  |  |  |  |  |  |  |  |  |  |  |  |  |  |  |  |  |  |  |  |  |  |  |  |  |  |  |  |  |
| Nov-18 | 3.9 |  |  |  |  |  |  |  |  |  |  |  |  |  |  |  |  |  |  |  |  |  |  |  |  |  |  |  |  |  |  |  |  |  |  |  |  |  |  |  |  |  |  |  |  |  |  |  |  |  |  |
| Dec-18 | 5.1 |  |  |  |  |  |  |  |  |  |  |  |  |  |  |  |  |  |  |  |  |  |  |  |  |  |  |  |  |  |  |  |  |  |  |  |  |  |  |  |  |  |  |  |  |  |  |  |  |  |  |
| Jan-19 | 6.4 |  |  |  |  |  |  |  |  |  |  |  |  |  |  |  |  |  |  |  |  |  |  |  |  |  |  |  |  |  |  |  |  |  |  |  |  |  |  |  |  |  |  |  |  |  |  |  |  |  |  |
| Feb-19 | 6.2 |  |  |  |  |  |  |  |  |  |  |  |  |  |  |  |  |  |  |  |  |  |  |  |  |  |  |  |  |  |  |  |  |  |  |  |  |  |  |  |  |  |  |  |  |  |  |  |  |  |  |
| Mar-19 | 5.2 |  |  |  |  |  |  |  |  |  |  |  |  |  |  |  |  |  |  |  |  |  |  |  |  |  |  |  |  |  |  |  |  |  |  |  |  |  |  |  |  |  |  |  |  |  |  |  |  |  |  |
| Apr-19 | 4.7 |  |  |  |  |  |  |  |  |  |  |  |  |  |  |  |  |  |  |  |  |  |  |  |  |  |  |  |  |  |  |  |  |  |  |  |  |  |  |  |  |  |  |  |  |  |  |  |  |  |  |
| May-19 | 3.2 |  |  |  |  |  |  |  |  |  |  |  |  |  |  |  |  |  |  |  |  |  |  |  |  |  |  |  |  |  |  |  |  |  |  |  |  |  |  |  |  |  |  |  |  |  |  |  |  |  |  |
| Jun-19 | 4 |  |  |  |  |  |  |  |  |  |  |  |  |  |  |  |  |  |  |  |  |  |  |  |  |  |  |  |  |  |  |  |  |  |  |  |  |  |  |  |  |  |  |  |  |  |  |  |  |  |  |
| Jul-19 | 3.8 |  |  |  |  |  |  |  |  |  |  |  |  |  |  |  |  |  |  |  |  |  |  |  |  |  |  |  |  |  |  |  |  |  |  |  |  |  |  |  |  |  |  |  |  |  |  |  |  |  |  |
| Aug-19 | 3.6 |  |  |  |  |  |  |  |  |  |  |  |  |  |  |  |  |  |  |  |  |  |  |  |  |  |  |  |  |  |  |  |  |  |  |  |  |  |  |  |  |  |  |  |  |  |  |  |  |  |  |
| Sep-19 | 3.2 |  |  |  |  |  |  |  |  |  |  |  |  |  |  |  |  |  |  |  |  |  |  |  |  |  |  |  |  |  |  |  |  |  |  |  |  |  |  |  |  |  |  |  |  |  |  |  |  |  |  |
| Oct-19 | 4 |  |  |  |  |  |  |  |  |  |  |  |  |  |  |  |  |  |  |  |  |  |  |  |  |  |  |  |  |  |  |  |  |  |  |  |  |  |  |  |  |  |  |  |  |  |  |  |  |  |  |
| Nov-19 | 4.4 |  |  |  |  |  |  |  |  |  |  |  |  |  |  |  |  |  |  |  |  |  |  |  |  |  |  |  |  |  |  |  |  |  |  |  |  |  |  |  |  |  |  |  |  |  |  |  |  |  |  |
| Dec-19 | 5 |  |  |  |  |  |  |  |  |  |  |  |  |  |  |  |  |  |  |  |  |  |  |  |  |  |  |  |  |  |  |  |  |  |  |  |  |  |  |  |  |  |  |  |  |  |  |  |  |  |  |
| Jan-20 | 5.4 |  |  |  |  |  |  |  |  |  |  |  |  |  |  |  |  |  |  |  |  |  |  |  |  |  |  |  |  |  |  |  |  |  |  |  |  |  |  |  |  |  |  |  |  |  |  |  |  |  |  |
| Feb-20 | 5.5 |  |  |  |  |  |  |  |  |  |  |  |  |  |  |  |  |  |  |  |  |  |  |  |  |  |  |  |  |  |  |  |  |  |  |  |  |  |  |  |  |  |  |  |  |  |  |  |  |  |  |
| Mar-20 | 6.9 |  |  |  |  |  |  |  |  |  |  |  |  |  |  |  |  |  |  |  |  |  |  |  |  |  |  |  |  |  |  |  |  |  |  |  |  |  |  |  |  |  |  |  |  |  |  |  |  |  |  |
| Apr-20 | 16.6 |  |  |  |  |  |  |  |  |  |  |  |  |  |  |  |  |  |  |  |  |  |  |  |  |  |  |  |  |  |  |  |  |  |  |  |  |  |  |  |  |  |  |  |  |  |  |  |  |  |  |
| May-20 | 12.7 |  |  |  |  |  |  |  |  |  |  |  |  |  |  |  |  |  |  |  |  |  |  |  |  |  |  |  |  |  |  |  |  |  |  |  |  |  |  |  |  |  |  |  |  |  |  |  |  |  |  |
| Jun-20 | 10.1 |  |  |  |  |  |  |  |  |  |  |  |  |  |  |  |  |  |  |  |  |  |  |  |  |  |  |  |  |  |  |  |  |  |  |  |  |  |  |  |  |  |  |  |  |  |  |  |  |  |  |
| Jul-20 | 8.9 |  |  |  |  |  |  |  |  |  |  |  |  |  |  |  |  |  |  |  |  |  |  |  |  |  |  |  |  |  |  |  |  |  |  |  |  |  |  |  |  |  |  |  |  |  |  |  |  |  |  |
| Aug-20 | 7.6 |  |  |  |  |  |  |  |  |  |  |  |  |  |  |  |  |  |  |  |  |  |  |  |  |  |  |  |  |  |  |  |  |  |  |  |  |  |  |  |  |  |  |  |  |  |  |  |  |  |  |
| Sep-20 | 7.1 |  |  |  |  |  |  |  |  |  |  |  |  |  |  |  |  |  |  |  |  |  |  |  |  |  |  |  |  |  |  |  |  |  |  |  |  |  |  |  |  |  |  |  |  |  |  |  |  |  |  |
| Oct-20 | 6.8 |  |  |  |  |  |  |  |  |  |  |  |  |  |  |  |  |  |  |  |  |  |  |  |  |  |  |  |  |  |  |  |  |  |  |  |  |  |  |  |  |  |  |  |  |  |  |  |  |  |  |
| Nov-20 | 7.3 |  |  |  |  |  |  |  |  |  |  |  |  |  |  |  |  |  |  |  |  |  |  |  |  |  |  |  |  |  |  |  |  |  |  |  |  |  |  |  |  |  |  |  |  |  |  |  |  |  |  |
| Dec-20 | 9.6 |  |  |  |  |  |  |  |  |  |  |  |  |  |  |  |  |  |  |  |  |  |  |  |  |  |  |  |  |  |  |  |  |  |  |  |  |  |  |  |  |  |  |  |  |  |  |  |  |  |  |
| Jan-21 | 9.4 |  |  |  |  |  |  |  |  |  |  |  |  |  |  |  |  |  |  |  |  |  |  |  |  |  |  |  |  |  |  |  |  |  |  |  |  |  |  |  |  |  |  |  |  |  |  |  |  |  |  |
| Feb-21 | 9.6 |  |  |  |  |  |  |  |  |  |  |  |  |  |  |  |  |  |  |  |  |  |  |  |  |  |  |  |  |  |  |  |  |  |  |  |  |  |  |  |  |  |  |  |  |  |  |  |  |  |  |
| Mar-21 | 8.6 |  |  |  |  |  |  |  |  |  |  |  |  |  |  |  |  |  |  |  |  |  |  |  |  |  |  |  |  |  |  |  |  |  |  |  |  |  |  |  |  |  |  |  |  |  |  |  |  |  |  |
| Apr-21 | 7.7 |  |  |  |  |  |  |  |  |  |  |  |  |  |  |  |  |  |  |  |  |  |  |  |  |  |  |  |  |  |  |  |  |  |  |  |  |  |  |  |  |  |  |  |  |  |  |  |  |  |  |
| May-21 | 6.7 |  |  |  |  |  |  |  |  |  |  |  |  |  |  |  |  |  |  |  |  |  |  |  |  |  |  |  |  |  |  |  |  |  |  |  |  |  |  |  |  |  |  |  |  |  |  |  |  |  |  |
| Jun-21 | 7.5 |  |  |  |  |  |  |  |  |  |  |  |  |  |  |  |  |  |  |  |  |  |  |  |  |  |  |  |  |  |  |  |  |  |  |  |  |  |  |  |  |  |  |  |  |  |  |  |  |  |  |
| Jul-21 | 6.1 |  |  |  |  |  |  |  |  |  |  |  |  |  |  |  |  |  |  |  |  |  |  |  |  |  |  |  |  |  |  |  |  |  |  |  |  |  |  |  |  |  |  |  |  |  |  |  |  |  |  |
| Aug-21 | 4.6 |  |  |  |  |  |  |  |  |  |  |  |  |  |  |  |  |  |  |  |  |  |  |  |  |  |  |  |  |  |  |  |  |  |  |  |  |  |  |  |  |  |  |  |  |  |  |  |  |  |  |
| Sep-21 | 4.5 |  |  |  |  |  |  |  |  |  |  |  |  |  |  |  |  |  |  |  |  |  |  |  |  |  |  |  |  |  |  |  |  |  |  |  |  |  |  |  |  |  |  |  |  |  |  |  |  |  |  |
| Oct-21 | 4 |  |  |  |  |  |  |  |  |  |  |  |  |  |  |  |  |  |  |  |  |  |  |  |  |  |  |  |  |  |  |  |  |  |  |  |  |  |  |  |  |  |  |  |  |  |  |  |  |  |  |
| Nov-21 | 4.7 |  |  |  |  |  |  |  |  |  |  |  |  |  |  |  |  |  |  |  |  |  |  |  |  |  |  |  |  |  |  |  |  |  |  |  |  |  |  |  |  |  |  |  |  |  |  |  |  |  |  |
| Dec-21 | 5 |  |  |  |  |  |  |  |  |  |  |  |  |  |  |  |  |  |  |  |  |  |  |  |  |  |  |  |  |  |  |  |  |  |  |  |  |  |  |  |  |  |  |  |  |  |  |  |  |  |  |
| Jan-22 | 7.1 |  |  |  |  |  |  |  |  |  |  |  |  |  |  |  |  |  |  |  |  |  |  |  |  |  |  |  |  |  |  |  |  |  |  |  |  |  |  |  |  |  |  |  |  |  |  |  |  |  |  |
| Feb-22 | 6.7 |  |  |  |  |  |  |  |  |  |  |  |  |  |  |  |  |  |  |  |  |  |  |  |  |  |  |  |  |  |  |  |  |  |  |  |  |  |  |  |  |  |  |  |  |  |  |  |  |  |  |
| Mar-22 | 6 |  |  |  |  |  |  |  |  |  |  |  |  |  |  |  |  |  |  |  |  |  |  |  |  |  |  |  |  |  |  |  |  |  |  |  |  |  |  |  |  |  |  |  |  |  |  |  |  |  |  |
| Apr-22 | 4.6 |  |  |  |  |  |  |  |  |  |  |  |  |  |  |  |  |  |  |  |  |  |  |  |  |  |  |  |  |  |  |  |  |  |  |  |  |  |  |  |  |  |  |  |  |  |  |  |  |  |  |
| May-22 | 3.8 |  |  |  |  |  |  |  |  |  |  |  |  |  |  |  |  |  |  |  |  |  |  |  |  |  |  |  |  |  |  |  |  |  |  |  |  |  |  |  |  |  |  |  |  |  |  |  |  |  |  |
| Jun-22 | 3.7 |  |  |  |  |  |  |  |  |  |  |  |  |  |  |  |  |  |  |  |  |  |  |  |  |  |  |  |  |  |  |  |  |  |  |  |  |  |  |  |  |  |  |  |  |  |  |  |  |  |  |
| Jul-22 | 3.5 |  |  |  |  |  |  |  |  |  |  |  |  |  |  |  |  |  |  |  |  |  |  |  |  |  |  |  |  |  |  |  |  |  |  |  |  |  |  |  |  |  |  |  |  |  |  |  |  |  |  |
| Aug-22 | 3.9 |  |  |  |  |  |  |  |  |  |  |  |  |  |  |  |  |  |  |  |  |  |  |  |  |  |  |  |  |  |  |  |  |  |  |  |  |  |  |  |  |  |  |  |  |  |  |  |  |  |  |
| Sep-22 | 3.4 |  |  |  |  |  |  |  |  |  |  |  |  |  |  |  |  |  |  |  |  |  |  |  |  |  |  |  |  |  |  |  |  |  |  |  |  |  |  |  |  |  |  |  |  |  |  |  |  |  |  |
| Oct-22 | 4.1 |  |  |  |  |  |  |  |  |  |  |  |  |  |  |  |  |  |  |  |  |  |  |  |  |  |  |  |  |  |  |  |  |  |  |  |  |  |  |  |  |  |  |  |  |  |  |  |  |  |  |
| Nov-22 | 3.9 |  |  |  |  |  |  |  |  |  |  |  |  |  |  |  |  |  |  |  |  |  |  |  |  |  |  |  |  |  |  |  |  |  |  |  |  |  |  |  |  |  |  |  |  |  |  |  |  |  |  |
| Dec-22 | 4.4 |  |  |  |  |  |  |  |  |  |  |  |  |  |  |  |  |  |  |  |  |  |  |  |  |  |  |  |  |  |  |  |  |  |  |  |  |  |  |  |  |  |  |  |  |  |  |  |  |  |  |
| Jan-23 | 6.9 |  |  |  |  |  |  |  |  |  |  |  |  |  |  |  |  |  |  |  |  |  |  |  |  |  |  |  |  |  |  |  |  |  |  |  |  |  |  |  |  |  |  |  |  |  |  |  |  |  |  |
| Feb-23 | 6.6 |  |  |  |  |  |  |  |  |  |  |  |  |  |  |  |  |  |  |  |  |  |  |  |  |  |  |  |  |  |  |  |  |  |  |  |  |  |  |  |  |  |  |  |  |  |  |  |  |  |  |
| Mar-23 | 5.6 |  |  |  |  |  |  |  |  |  |  |  |  |  |  |  |  |  |  |  |  |  |  |  |  |  |  |  |  |  |  |  |  |  |  |  |  |  |  |  |  |  |  |  |  |  |  |  |  |  |  |
| Apr-23 | 4.1 |  |  |  |  |  |  |  |  |  |  |  |  |  |  |  |  |  |  |  |  |  |  |  |  |  |  |  |  |  |  |  |  |  |  |  |  |  |  |  |  |  |  |  |  |  |  |  |  |  |  |
| May-23 | 3.5 |  |  |  |  |  |  |  |  |  |  |  |  |  |  |  |  |  |  |  |  |  |  |  |  |  |  |  |  |  |  |  |  |  |  |  |  |  |  |  |  |  |  |  |  |  |  |  |  |  |  |
| Jun-23 | 3.6 |  |  |  |  |  |  |  |  |  |  |  |  |  |  |  |  |  |  |  |  |  |  |  |  |  |  |  |  |  |  |  |  |  |  |  |  |  |  |  |  |  |  |  |  |  |  |  |  |  |  |
| Jul-23 | 3.9 |  |  |  |  |  |  |  |  |  |  |  |  |  |  |  |  |  |  |  |  |  |  |  |  |  |  |  |  |  |  |  |  |  |  |  |  |  |  |  |  |  |  |  |  |  |  |  |  |  |  |
| Aug-23 | 3.9 |  |  |  |  |  |  |  |  |  |  |  |  |  |  |  |  |  |  |  |  |  |  |  |  |  |  |  |  |  |  |  |  |  |  |  |  |  |  |  |  |  |  |  |  |  |  |  |  |  |  |
| Sep-23 | 3.8 |  |  |  |  |  |  |  |  |  |  |  |  |  |  |  |  |  |  |  |  |  |  |  |  |  |  |  |  |  |  |  |  |  |  |  |  |  |  |  |  |  |  |  |  |  |  |  |  |  |  |
| Oct-23 | 4 |  |  |  |  |  |  |  |  |  |  |  |  |  |  |  |  |  |  |  |  |  |  |  |  |  |  |  |  |  |  |  |  |  |  |  |  |  |  |  |  |  |  |  |  |  |  |  |  |  |  |
| Nov-23 | 4.8 |  |  |  |  |  |  |  |  |  |  |  |  |  |  |  |  |  |  |  |  |  |  |  |  |  |  |  |  |  |  |  |  |  |  |  |  |  |  |  |  |  |  |  |  |  |  |  |  |  |  |
| Dec-23 | 4.4 |  |  |  |  |  |  |  |  |  |  |  |  |  |  |  |  |  |  |  |  |  |  |  |  |  |  |  |  |  |  |  |  |  |  |  |  |  |  |  |  |  |  |  |  |  |  |  |  |  |  |